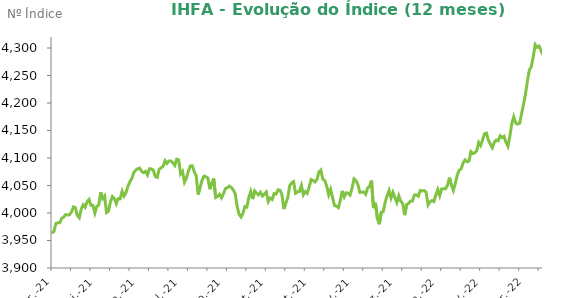
| Category | Series 0 |
|---|---|
| 2021-03-31 | 3963.24 |
| 2021-04-01 | 3966.52 |
| 2021-04-05 | 3980.85 |
| 2021-04-06 | 3982.14 |
| 2021-04-07 | 3982.23 |
| 2021-04-08 | 3990.34 |
| 2021-04-09 | 3992.5 |
| 2021-04-12 | 3997.03 |
| 2021-04-13 | 3996.38 |
| 2021-04-14 | 3996.89 |
| 2021-04-15 | 4001.89 |
| 2021-04-16 | 4011.06 |
| 2021-04-19 | 4009.7 |
| 2021-04-20 | 3995.43 |
| 2021-04-22 | 3991.36 |
| 2021-04-23 | 4006.88 |
| 2021-04-26 | 4014.86 |
| 2021-04-27 | 4010.42 |
| 2021-04-28 | 4020.49 |
| 2021-04-29 | 4024.6 |
| 2021-04-30 | 4014.13 |
| 2021-05-03 | 4013.92 |
| 2021-05-04 | 4000.09 |
| 2021-05-05 | 4012 |
| 2021-05-06 | 4014.61 |
| 2021-05-07 | 4037.62 |
| 2021-05-10 | 4026.17 |
| 2021-05-11 | 4030.82 |
| 2021-05-12 | 4000.86 |
| 2021-05-13 | 4003.37 |
| 2021-05-14 | 4020.47 |
| 2021-05-17 | 4029.9 |
| 2021-05-18 | 4026.19 |
| 2021-05-19 | 4016.94 |
| 2021-05-20 | 4026.11 |
| 2021-05-21 | 4025.85 |
| 2021-05-24 | 4039.62 |
| 2021-05-25 | 4030.75 |
| 2021-05-26 | 4037.36 |
| 2021-05-27 | 4048.85 |
| 2021-05-28 | 4056.99 |
| 2021-05-31 | 4062.88 |
| 2021-06-01 | 4073.78 |
| 2021-06-02 | 4078.02 |
| 2021-06-04 | 4080.46 |
| 2021-06-07 | 4081.73 |
| 2021-06-08 | 4075.77 |
| 2021-06-09 | 4073.34 |
| 2021-06-10 | 4075.79 |
| 2021-06-11 | 4069.2 |
| 2021-06-14 | 4080.4 |
| 2021-06-15 | 4080.27 |
| 2021-06-16 | 4077.96 |
| 2021-06-17 | 4066.35 |
| 2021-06-18 | 4064.81 |
| 2021-06-21 | 4079.53 |
| 2021-06-22 | 4082.14 |
| 2021-06-23 | 4084.93 |
| 2021-06-24 | 4095.07 |
| 2021-06-25 | 4090.09 |
| 2021-06-28 | 4094.54 |
| 2021-06-29 | 4094.67 |
| 2021-06-30 | 4091.19 |
| 2021-07-01 | 4086.52 |
| 2021-07-02 | 4097.86 |
| 2021-07-05 | 4096.51 |
| 2021-07-06 | 4070.87 |
| 2021-07-07 | 4075.44 |
| 2021-07-08 | 4056.16 |
| 2021-07-09 | 4063.56 |
| 2021-07-12 | 4076.5 |
| 2021-07-13 | 4085.56 |
| 2021-07-14 | 4085.78 |
| 2021-07-15 | 4075.11 |
| 2021-07-16 | 4067.77 |
| 2021-07-19 | 4033.75 |
| 2021-07-20 | 4046.31 |
| 2021-07-21 | 4059.3 |
| 2021-07-22 | 4066.98 |
| 2021-07-23 | 4065.91 |
| 2021-07-26 | 4063.49 |
| 2021-07-27 | 4043.27 |
| 2021-07-28 | 4054.41 |
| 2021-07-29 | 4062.71 |
| 2021-07-30 | 4028.14 |
| 2021-08-02 | 4030.13 |
| 2021-08-03 | 4033.93 |
| 2021-08-04 | 4027.52 |
| 2021-08-05 | 4034.98 |
| 2021-08-06 | 4044.43 |
| 2021-08-09 | 4046.2 |
| 2021-08-10 | 4048.89 |
| 2021-08-11 | 4046.7 |
| 2021-08-12 | 4042.07 |
| 2021-08-13 | 4035.54 |
| 2021-08-16 | 4012.2 |
| 2021-08-17 | 3997.84 |
| 2021-08-18 | 3992.73 |
| 2021-08-19 | 3999.27 |
| 2021-08-20 | 4011.78 |
| 2021-08-23 | 4010.67 |
| 2021-08-24 | 4028.05 |
| 2021-08-25 | 4039.1 |
| 2021-08-26 | 4025.41 |
| 2021-08-27 | 4040.01 |
| 2021-08-30 | 4035.92 |
| 2021-08-31 | 4033.08 |
| 2021-09-01 | 4037.66 |
| 2021-09-02 | 4030.79 |
| 2021-09-03 | 4034.61 |
| 2021-09-06 | 4038.27 |
| 2021-09-08 | 4020.87 |
| 2021-09-09 | 4027.15 |
| 2021-09-10 | 4024.8 |
| 2021-09-13 | 4035.39 |
| 2021-09-14 | 4034.54 |
| 2021-09-15 | 4042.17 |
| 2021-09-16 | 4041.49 |
| 2021-09-17 | 4033.61 |
| 2021-09-20 | 4007.25 |
| 2021-09-21 | 4018.04 |
| 2021-09-22 | 4027.91 |
| 2021-09-23 | 4049.69 |
| 2021-09-24 | 4054.89 |
| 2021-09-27 | 4057.13 |
| 2021-09-28 | 4035.95 |
| 2021-09-29 | 4038.34 |
| 2021-09-30 | 4039.3 |
| 2021-10-01 | 4050.05 |
| 2021-10-04 | 4033.15 |
| 2021-10-05 | 4038.94 |
| 2021-10-06 | 4035.78 |
| 2021-10-07 | 4047.57 |
| 2021-10-08 | 4060.84 |
| 2021-10-11 | 4059.07 |
| 2021-10-13 | 4056.52 |
| 2021-10-14 | 4061.11 |
| 2021-10-15 | 4074.77 |
| 2021-10-18 | 4078.05 |
| 2021-10-19 | 4061.42 |
| 2021-10-20 | 4059.05 |
| 2021-10-21 | 4048.86 |
| 2021-10-22 | 4033.16 |
| 2021-10-25 | 4043.06 |
| 2021-10-26 | 4027.86 |
| 2021-10-27 | 4013.41 |
| 2021-10-28 | 4012.41 |
| 2021-10-29 | 4009.78 |
| 2021-11-01 | 4023.42 |
| 2021-11-03 | 4040.16 |
| 2021-11-04 | 4029.18 |
| 2021-11-05 | 4036.69 |
| 2021-11-08 | 4035.95 |
| 2021-11-09 | 4032.66 |
| 2021-11-10 | 4045.02 |
| 2021-11-11 | 4062.03 |
| 2021-11-12 | 4059.02 |
| 2021-11-16 | 4051.69 |
| 2021-11-17 | 4037.47 |
| 2021-11-18 | 4037.78 |
| 2021-11-19 | 4038.26 |
| 2021-11-22 | 4034.06 |
| 2021-11-23 | 4045.6 |
| 2021-11-24 | 4048.5 |
| 2021-11-25 | 4058.96 |
| 2021-11-26 | 4008.94 |
| 2021-11-29 | 4018.61 |
| 2021-11-30 | 3990.07 |
| 2021-12-01 | 3979.51 |
| 2021-12-02 | 4001.4 |
| 2021-12-03 | 4002.43 |
| 2021-12-06 | 4019.49 |
| 2021-12-07 | 4031.65 |
| 2021-12-08 | 4040.97 |
| 2021-12-09 | 4027.29 |
| 2021-12-10 | 4037.68 |
| 2021-12-13 | 4028.23 |
| 2021-12-14 | 4019.14 |
| 2021-12-15 | 4031.45 |
| 2021-12-16 | 4021.15 |
| 2021-12-17 | 4017.55 |
| 2021-12-20 | 3996.12 |
| 2021-12-21 | 4015.29 |
| 2021-12-22 | 4017.47 |
| 2021-12-23 | 4021.73 |
| 2021-12-24 | 4021.88 |
| 2021-12-27 | 4032.68 |
| 2021-12-28 | 4032.76 |
| 2021-12-29 | 4030.47 |
| 2021-12-30 | 4040.91 |
| 2021-12-31 | 4040.03 |
| 2022-01-03 | 4040.78 |
| 2022-01-04 | 4038.01 |
| 2022-01-05 | 4014.68 |
| 2022-01-06 | 4020.43 |
| 2022-01-07 | 4022.59 |
| 2022-01-10 | 4020.86 |
| 2022-01-11 | 4032.64 |
| 2022-01-12 | 4042.77 |
| 2022-01-13 | 4031.63 |
| 2022-01-14 | 4043.7 |
| 2022-01-17 | 4044.11 |
| 2022-01-18 | 4044.11 |
| 2022-01-19 | 4050.58 |
| 2022-01-20 | 4064.28 |
| 2022-01-21 | 4050.45 |
| 2022-01-24 | 4040.88 |
| 2022-01-25 | 4053.68 |
| 2022-01-26 | 4069.02 |
| 2022-01-27 | 4077.83 |
| 2022-01-28 | 4080.12 |
| 2022-01-31 | 4091 |
| 2022-02-01 | 4096.58 |
| 2022-02-02 | 4092.98 |
| 2022-02-03 | 4094.44 |
| 2022-02-04 | 4111.68 |
| 2022-02-07 | 4108.1 |
| 2022-02-08 | 4109.29 |
| 2022-02-09 | 4113.45 |
| 2022-02-10 | 4128.21 |
| 2022-02-11 | 4122.64 |
| 2022-02-14 | 4133.21 |
| 2022-02-15 | 4144.05 |
| 2022-02-16 | 4145.22 |
| 2022-02-17 | 4132.01 |
| 2022-02-18 | 4125.03 |
| 2022-02-21 | 4118.77 |
| 2022-02-22 | 4128.67 |
| 2022-02-23 | 4132.58 |
| 2022-02-24 | 4131.29 |
| 2022-02-25 | 4140.33 |
| 2022-03-02 | 4137.29 |
| 2022-03-03 | 4139.42 |
| 2022-03-04 | 4128.34 |
| 2022-03-07 | 4121.36 |
| 2022-03-08 | 4139.88 |
| 2022-03-09 | 4163.01 |
| 2022-03-10 | 4174.94 |
| 2022-03-11 | 4163.25 |
| 2022-03-14 | 4161.62 |
| 2022-03-15 | 4163.17 |
| 2022-03-16 | 4180.27 |
| 2022-03-17 | 4197.38 |
| 2022-03-18 | 4216.15 |
| 2022-03-21 | 4239.96 |
| 2022-03-22 | 4259.92 |
| 2022-03-23 | 4266.14 |
| 2022-03-24 | 4284.17 |
| 2022-03-25 | 4306.04 |
| 2022-03-28 | 4301.17 |
| 2022-03-29 | 4303.43 |
| 2022-03-30 | 4294.86 |
| 2022-03-31 | 4287.32 |